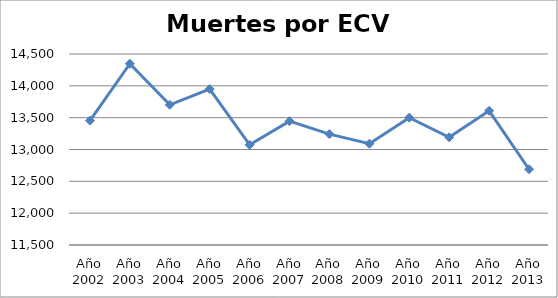
| Category | Series 0 |
|---|---|
| Año 2002 | 13454 |
| Año 2003 | 14347 |
| Año 2004 | 13702 |
| Año 2005 | 13950 |
| Año 2006 | 13073 |
| Año 2007 | 13445 |
| Año 2008 | 13241 |
| Año 2009 | 13091 |
| Año 2010 | 13500 |
| Año 2011 | 13191 |
| Año 2012 | 13608 |
| Año 2013 | 12690 |